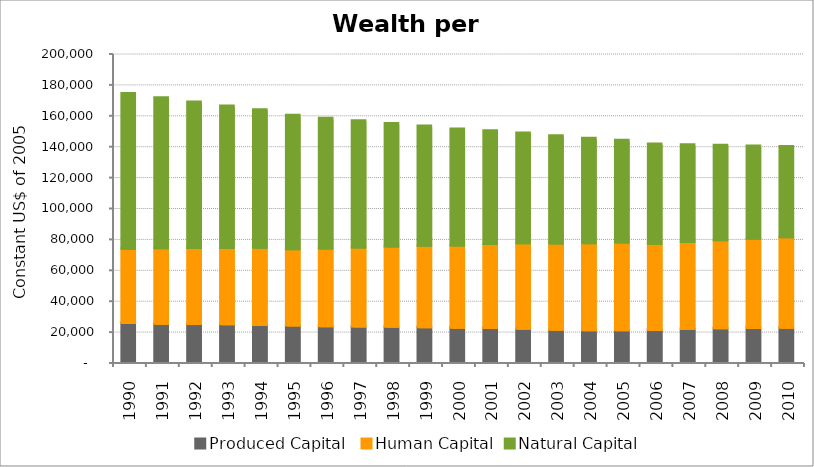
| Category | Produced Capital  | Human Capital | Natural Capital |
|---|---|---|---|
| 1990.0 | 25171.691 | 48120.087 | 100440.351 |
| 1991.0 | 24724.697 | 48844.755 | 97466.226 |
| 1992.0 | 24622.899 | 49163.782 | 94536.337 |
| 1993.0 | 24430.53 | 49401.722 | 91847.851 |
| 1994.0 | 24002.053 | 50007.191 | 89259.173 |
| 1995.0 | 23596.971 | 49429.008 | 86752.056 |
| 1996.0 | 23141.522 | 50351.428 | 84318.765 |
| 1997.0 | 22928.298 | 51215.25 | 81927.728 |
| 1998.0 | 22777.048 | 51982.049 | 79647.054 |
| 1999.0 | 22437.047 | 52732.667 | 77503.021 |
| 2000.0 | 22131.41 | 53326.652 | 75290.56 |
| 2001.0 | 21967.47 | 54372.562 | 73268.293 |
| 2002.0 | 21598.183 | 55331.53 | 71344.774 |
| 2003.0 | 20914.952 | 55862.416 | 69582.262 |
| 2004.0 | 20537.636 | 56376.892 | 67856.785 |
| 2005.0 | 20480.756 | 56877.912 | 66174.812 |
| 2006.0 | 20732.464 | 55778.855 | 64561.482 |
| 2007.0 | 21306.495 | 56342.447 | 63018.93 |
| 2008.0 | 21766.011 | 56961.593 | 61533.129 |
| 2009.0 | 22047.586 | 57743.595 | 60087.557 |
| 2010.0 | 22232.639 | 58532.965 | 58732.993 |